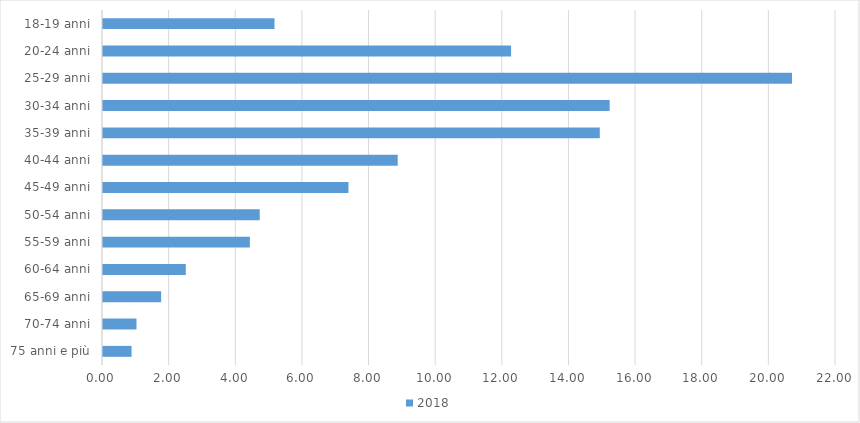
| Category | 2018 |
|---|---|
| 75 anni e più | 0.888 |
| 70-74 anni | 1.036 |
| 65-69 anni | 1.775 |
| 60-64 anni | 2.515 |
| 55-59 anni | 4.438 |
| 50-54 anni | 4.734 |
| 45-49 anni | 7.396 |
| 40-44 anni | 8.876 |
| 35-39 anni | 14.941 |
| 30-34 anni | 15.237 |
| 25-29 anni | 20.71 |
| 20-24 anni | 12.278 |
| 18-19 anni | 5.178 |